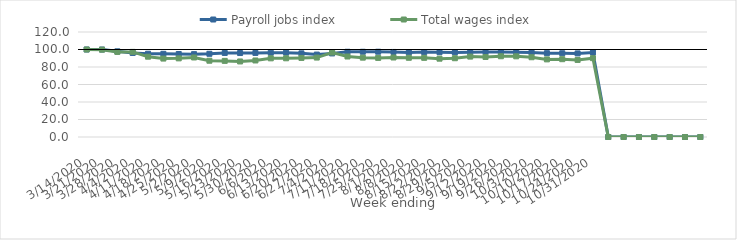
| Category | Payroll jobs index | Total wages index |
|---|---|---|
| 14/03/2020 | 100 | 100 |
| 21/03/2020 | 99.966 | 99.817 |
| 28/03/2020 | 97.924 | 97.227 |
| 04/04/2020 | 96.063 | 97.28 |
| 11/04/2020 | 95.146 | 91.784 |
| 18/04/2020 | 95.066 | 89.638 |
| 25/04/2020 | 94.851 | 89.862 |
| 02/05/2020 | 94.695 | 90.877 |
| 09/05/2020 | 95.094 | 87.166 |
| 16/05/2020 | 96.059 | 86.995 |
| 23/05/2020 | 95.948 | 86.337 |
| 30/05/2020 | 96.073 | 87.449 |
| 06/06/2020 | 96.296 | 89.903 |
| 13/06/2020 | 96.425 | 89.947 |
| 20/06/2020 | 95.601 | 90.374 |
| 27/06/2020 | 94.198 | 90.778 |
| 04/07/2020 | 95.514 | 96.535 |
| 11/07/2020 | 97.405 | 91.975 |
| 18/07/2020 | 97.402 | 90.681 |
| 25/07/2020 | 97.46 | 90.383 |
| 01/08/2020 | 97.196 | 90.851 |
| 08/08/2020 | 96.687 | 90.533 |
| 15/08/2020 | 97.003 | 90.472 |
| 22/08/2020 | 96.901 | 89.515 |
| 29/08/2020 | 96.703 | 90.019 |
| 05/09/2020 | 96.822 | 91.892 |
| 12/09/2020 | 97.133 | 91.458 |
| 19/09/2020 | 97.03 | 92.276 |
| 26/09/2020 | 96.759 | 92.189 |
| 03/10/2020 | 96.562 | 91.147 |
| 10/10/2020 | 95.81 | 88.699 |
| 17/10/2020 | 95.728 | 88.911 |
| 24/10/2020 | 95.534 | 88.071 |
| 31/10/2020 | 96.59 | 90.103 |